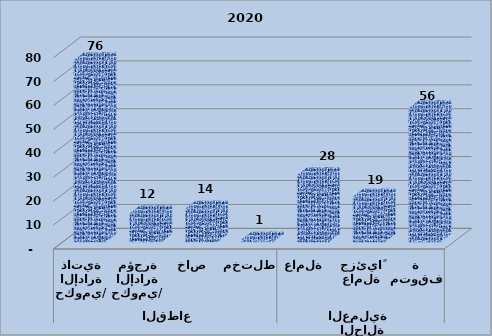
| Category | Series 0 |
|---|---|
| 0 | 76 |
| 1 | 12 |
| 2 | 14 |
| 3 | 1 |
| 4 | 28 |
| 5 | 19 |
| 6 | 56 |